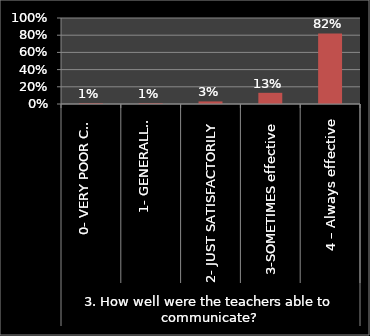
| Category | Series 0 |
|---|---|
| 0 | 0.01 |
| 1 | 0.01 |
| 2 | 0.03 |
| 3 | 0.13 |
| 4 | 0.82 |